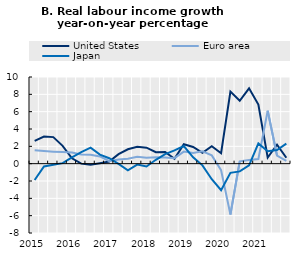
| Category | United States | Euro area | Japan |
|---|---|---|---|
| 2015 | 2.622 | 1.546 | -1.89 |
|  | 3.133 | 1.462 | -0.329 |
|  | 3.063 | 1.389 | -0.133 |
|  | 2.055 | 1.334 | 0.06 |
| 2016 | 0.615 | 1.286 | 0.722 |
|  | 0.002 | 1.064 | 1.334 |
|  | -0.111 | 1.02 | 1.845 |
|  | 0.054 | 0.831 | 1.051 |
| 2017 | 0.242 | 0.279 | 0.626 |
|  | 1.095 | 0.485 | -0.028 |
|  | 1.662 | 0.577 | -0.77 |
|  | 1.955 | 0.789 | -0.11 |
| 2018 | 1.85 | 0.677 | -0.323 |
|  | 1.321 | 0.74 | 0.447 |
|  | 1.352 | 0.719 | 1.105 |
|  | 0.565 | 0.634 | 1.524 |
| 2019 | 2.241 | 1.391 | 2.039 |
|  | 1.932 | 1.236 | 0.734 |
|  | 1.243 | 1.421 | -0.192 |
|  | 2.011 | 0.954 | -1.798 |
| 2020 | 1.206 | -0.75 | -3.065 |
|  | 8.321 | -5.869 | -1.061 |
|  | 7.253 | 0.273 | -0.891 |
|  | 8.693 | 0.412 | -0.196 |
| 2021 | 6.826 | 0.532 | 2.336 |